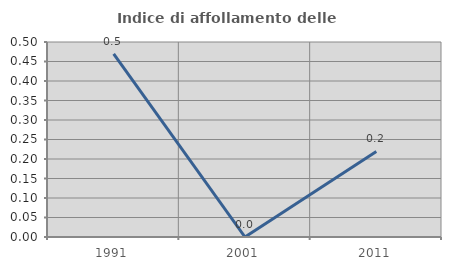
| Category | Indice di affollamento delle abitazioni  |
|---|---|
| 1991.0 | 0.469 |
| 2001.0 | 0 |
| 2011.0 | 0.219 |